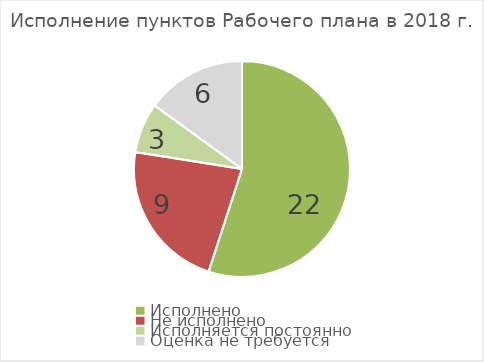
| Category | Series 0 |
|---|---|
| Исполнено | 22 |
| Не исполнено | 9 |
| Исполняется постоянно | 3 |
| Оценка не требуется | 6 |